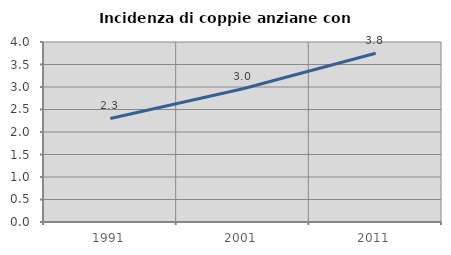
| Category | Incidenza di coppie anziane con figli |
|---|---|
| 1991.0 | 2.301 |
| 2001.0 | 2.963 |
| 2011.0 | 3.751 |